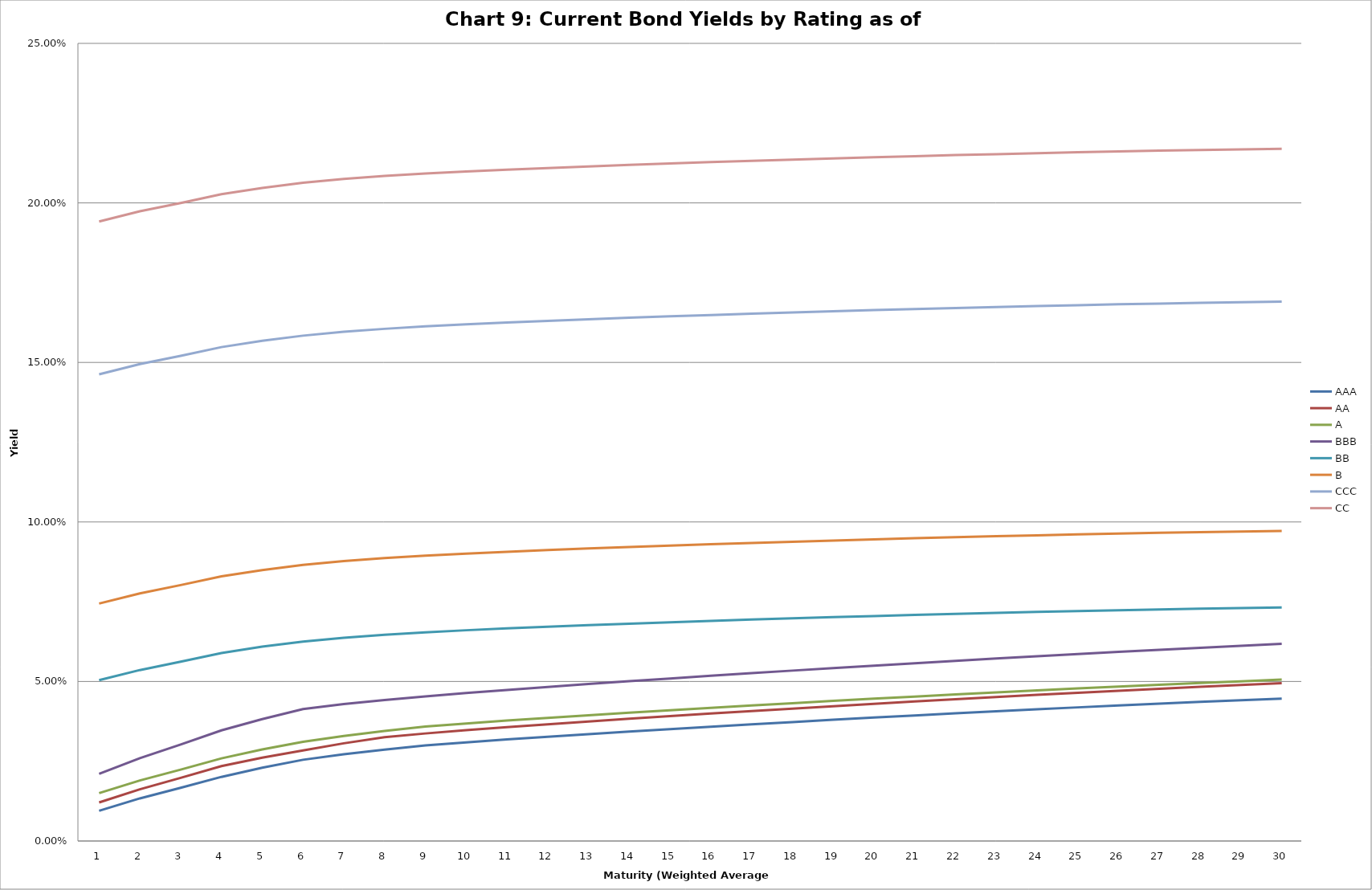
| Category | AAA | AA | A | BBB | BB | B | CCC | CC |
|---|---|---|---|---|---|---|---|---|
| 0 | 0.009 | 0.012 | 0.015 | 0.021 | 0.05 | 0.074 | 0.146 | 0.194 |
| 1 | 0.013 | 0.016 | 0.019 | 0.026 | 0.054 | 0.078 | 0.149 | 0.197 |
| 2 | 0.017 | 0.02 | 0.022 | 0.03 | 0.056 | 0.08 | 0.152 | 0.2 |
| 3 | 0.02 | 0.023 | 0.026 | 0.035 | 0.059 | 0.083 | 0.155 | 0.203 |
| 4 | 0.023 | 0.026 | 0.029 | 0.038 | 0.061 | 0.085 | 0.157 | 0.205 |
| 5 | 0.025 | 0.028 | 0.031 | 0.041 | 0.063 | 0.087 | 0.158 | 0.206 |
| 6 | 0.027 | 0.031 | 0.033 | 0.043 | 0.064 | 0.088 | 0.16 | 0.208 |
| 7 | 0.029 | 0.033 | 0.034 | 0.044 | 0.065 | 0.089 | 0.161 | 0.208 |
| 8 | 0.03 | 0.034 | 0.036 | 0.045 | 0.065 | 0.089 | 0.161 | 0.209 |
| 9 | 0.031 | 0.035 | 0.037 | 0.046 | 0.066 | 0.09 | 0.162 | 0.21 |
| 10 | 0.032 | 0.036 | 0.038 | 0.047 | 0.067 | 0.091 | 0.163 | 0.21 |
| 11 | 0.033 | 0.037 | 0.039 | 0.048 | 0.067 | 0.091 | 0.163 | 0.211 |
| 12 | 0.034 | 0.037 | 0.039 | 0.049 | 0.068 | 0.092 | 0.164 | 0.211 |
| 13 | 0.034 | 0.038 | 0.04 | 0.05 | 0.068 | 0.092 | 0.164 | 0.212 |
| 14 | 0.035 | 0.039 | 0.041 | 0.051 | 0.069 | 0.093 | 0.164 | 0.212 |
| 15 | 0.036 | 0.04 | 0.042 | 0.052 | 0.069 | 0.093 | 0.165 | 0.213 |
| 16 | 0.037 | 0.041 | 0.042 | 0.053 | 0.069 | 0.093 | 0.165 | 0.213 |
| 17 | 0.037 | 0.042 | 0.043 | 0.053 | 0.07 | 0.094 | 0.166 | 0.214 |
| 18 | 0.038 | 0.042 | 0.044 | 0.054 | 0.07 | 0.094 | 0.166 | 0.214 |
| 19 | 0.039 | 0.043 | 0.045 | 0.055 | 0.071 | 0.095 | 0.166 | 0.214 |
| 20 | 0.039 | 0.044 | 0.045 | 0.056 | 0.071 | 0.095 | 0.167 | 0.215 |
| 21 | 0.04 | 0.044 | 0.046 | 0.056 | 0.071 | 0.095 | 0.167 | 0.215 |
| 22 | 0.041 | 0.045 | 0.047 | 0.057 | 0.071 | 0.096 | 0.167 | 0.215 |
| 23 | 0.041 | 0.046 | 0.047 | 0.058 | 0.072 | 0.096 | 0.168 | 0.216 |
| 24 | 0.042 | 0.046 | 0.048 | 0.059 | 0.072 | 0.096 | 0.168 | 0.216 |
| 25 | 0.042 | 0.047 | 0.048 | 0.059 | 0.072 | 0.096 | 0.168 | 0.216 |
| 26 | 0.043 | 0.048 | 0.049 | 0.06 | 0.073 | 0.097 | 0.168 | 0.216 |
| 27 | 0.044 | 0.048 | 0.05 | 0.061 | 0.073 | 0.097 | 0.169 | 0.217 |
| 28 | 0.044 | 0.049 | 0.05 | 0.061 | 0.073 | 0.097 | 0.169 | 0.217 |
| 29 | 0.045 | 0.049 | 0.051 | 0.062 | 0.073 | 0.097 | 0.169 | 0.217 |